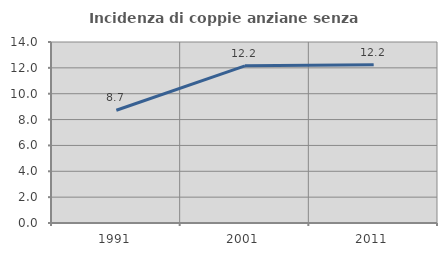
| Category | Incidenza di coppie anziane senza figli  |
|---|---|
| 1991.0 | 8.721 |
| 2001.0 | 12.155 |
| 2011.0 | 12.234 |